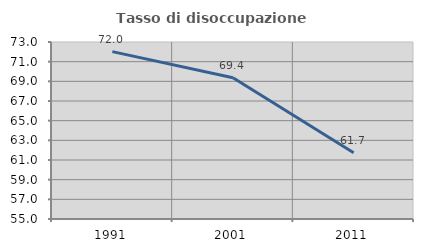
| Category | Tasso di disoccupazione giovanile  |
|---|---|
| 1991.0 | 72.019 |
| 2001.0 | 69.368 |
| 2011.0 | 61.734 |